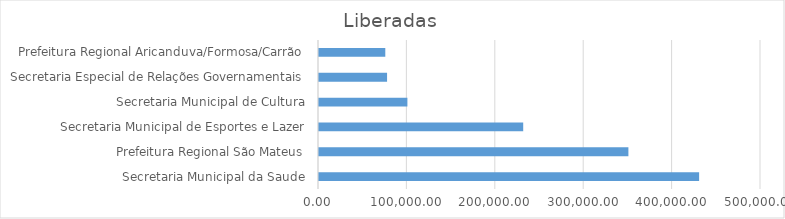
| Category | Series 0 |
|---|---|
| Secretaria Municipal da Saude | 430000 |
| Prefeitura Regional São Mateus | 350000 |
| Secretaria Municipal de Esportes e Lazer | 231000 |
| Secretaria Municipal de Cultura | 100000 |
| Secretaria Especial de Relações Governamentais | 77000 |
| Prefeitura Regional Aricanduva/Formosa/Carrão | 75000 |